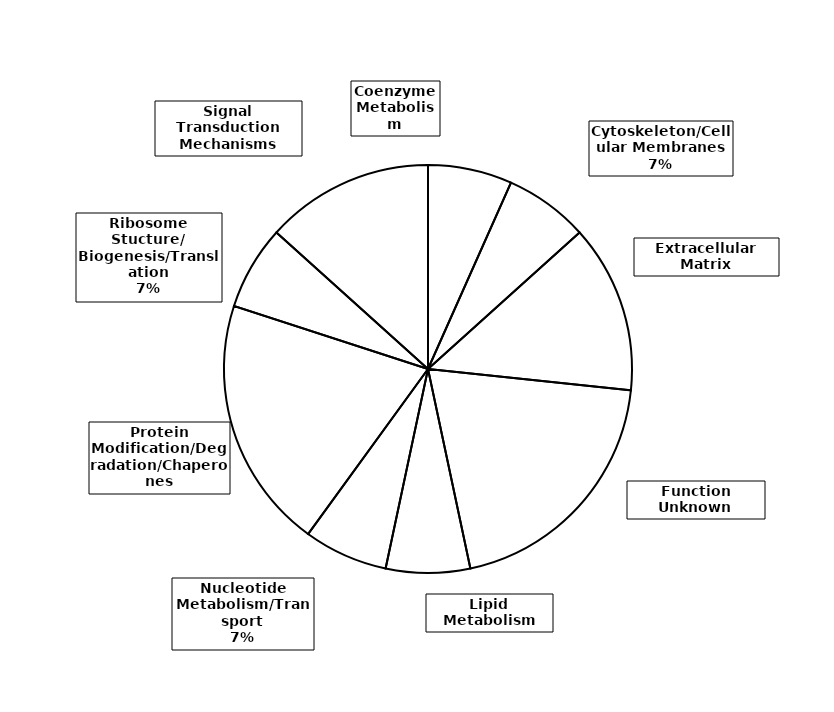
| Category | Series 0 |
|---|---|
| Coenzyme Metabolism | 1 |
| Cytoskeleton/Cellular Membranes | 1 |
| Extracellular Matrix | 2 |
| Function Unknown | 3 |
| Lipid Metabolism | 1 |
| Nucleotide Metabolism/Transport | 1 |
| Protein Modification/Degradation/Chaperones | 3 |
| Ribosome Stucture/
Biogenesis/Translation | 1 |
| Signal Transduction Mechanisms | 2 |